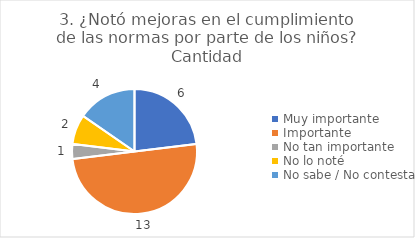
| Category | 3. ¿Notó mejoras en el cumplimiento de las normas por parte de los niños? |
|---|---|
| Muy importante  | 0.231 |
| Importante  | 0.5 |
| No tan importante  | 0.038 |
| No lo noté  | 0.077 |
| No sabe / No contesta | 0.154 |